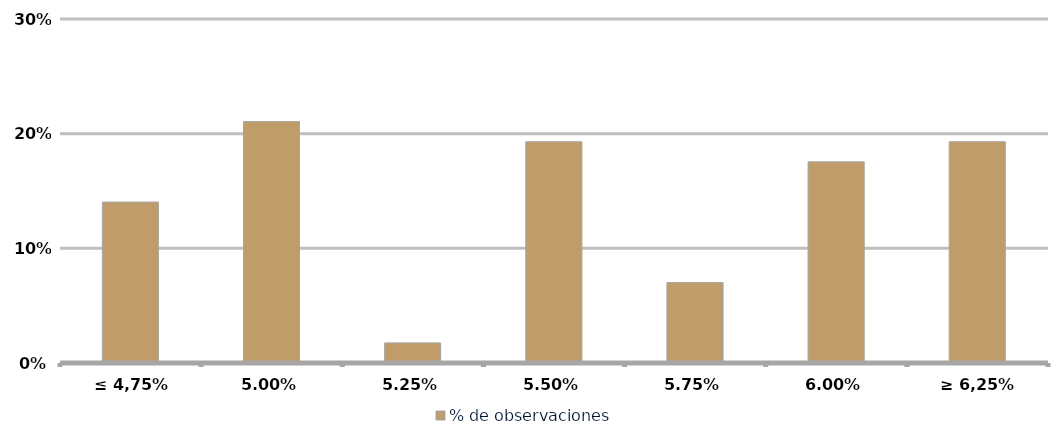
| Category | % de observaciones  |
|---|---|
| ≤ 4,75% | 0.14 |
| 5,00% | 0.211 |
| 5,25% | 0.018 |
| 5,50% | 0.193 |
| 5,75% | 0.07 |
| 6,00% | 0.175 |
| ≥ 6,25% | 0.193 |